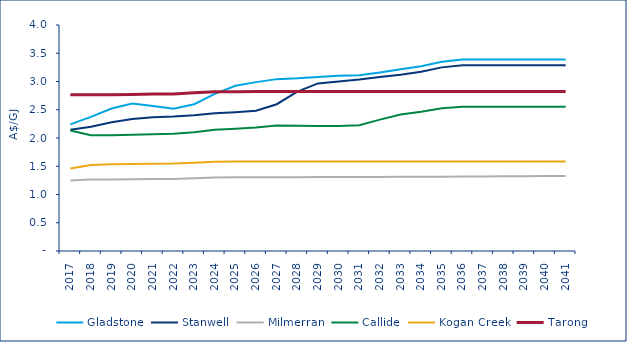
| Category | Gladstone | Stanwell | Milmerran | Callide | Kogan Creek | Tarong |
|---|---|---|---|---|---|---|
| 2017.0 | 2.242 | 2.145 | 1.249 | 2.132 | 1.459 | 2.766 |
| 2018.0 | 2.373 | 2.2 | 1.265 | 2.048 | 1.521 | 2.766 |
| 2019.0 | 2.523 | 2.279 | 1.265 | 2.048 | 1.535 | 2.766 |
| 2020.0 | 2.609 | 2.336 | 1.269 | 2.058 | 1.54 | 2.772 |
| 2021.0 | 2.567 | 2.369 | 1.274 | 2.066 | 1.546 | 2.778 |
| 2022.0 | 2.517 | 2.38 | 1.275 | 2.074 | 1.547 | 2.779 |
| 2023.0 | 2.598 | 2.402 | 1.289 | 2.1 | 1.564 | 2.799 |
| 2024.0 | 2.78 | 2.437 | 1.303 | 2.148 | 1.581 | 2.819 |
| 2025.0 | 2.925 | 2.456 | 1.304 | 2.163 | 1.582 | 2.82 |
| 2026.0 | 2.989 | 2.481 | 1.305 | 2.184 | 1.583 | 2.821 |
| 2027.0 | 3.042 | 2.598 | 1.305 | 2.222 | 1.584 | 2.822 |
| 2028.0 | 3.056 | 2.821 | 1.306 | 2.215 | 1.585 | 2.824 |
| 2029.0 | 3.079 | 2.966 | 1.308 | 2.214 | 1.586 | 2.824 |
| 2030.0 | 3.102 | 3.001 | 1.309 | 2.211 | 1.586 | 2.824 |
| 2031.0 | 3.11 | 3.035 | 1.31 | 2.226 | 1.586 | 2.824 |
| 2032.0 | 3.161 | 3.078 | 1.311 | 2.325 | 1.586 | 2.824 |
| 2033.0 | 3.215 | 3.12 | 1.313 | 2.416 | 1.586 | 2.824 |
| 2034.0 | 3.271 | 3.174 | 1.314 | 2.466 | 1.586 | 2.824 |
| 2035.0 | 3.349 | 3.25 | 1.316 | 2.525 | 1.586 | 2.824 |
| 2036.0 | 3.389 | 3.289 | 1.317 | 2.554 | 1.586 | 2.824 |
| 2037.0 | 3.389 | 3.289 | 1.319 | 2.554 | 1.586 | 2.824 |
| 2038.0 | 3.389 | 3.289 | 1.321 | 2.554 | 1.586 | 2.824 |
| 2039.0 | 3.389 | 3.289 | 1.323 | 2.554 | 1.586 | 2.824 |
| 2040.0 | 3.389 | 3.289 | 1.326 | 2.554 | 1.586 | 2.824 |
| 2041.0 | 3.389 | 3.289 | 1.328 | 2.554 | 1.586 | 2.824 |